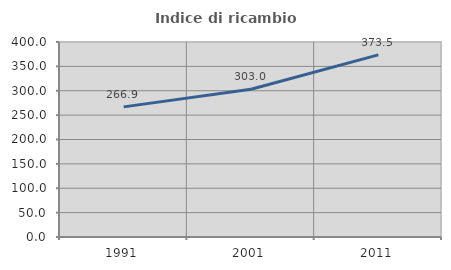
| Category | Indice di ricambio occupazionale  |
|---|---|
| 1991.0 | 266.897 |
| 2001.0 | 303.049 |
| 2011.0 | 373.51 |